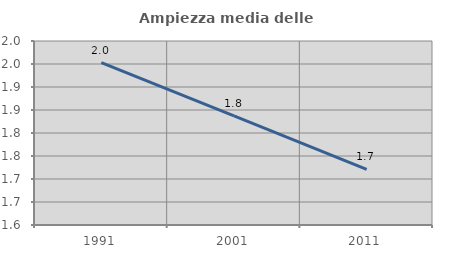
| Category | Ampiezza media delle famiglie |
|---|---|
| 1991.0 | 1.953 |
| 2001.0 | 1.837 |
| 2011.0 | 1.721 |